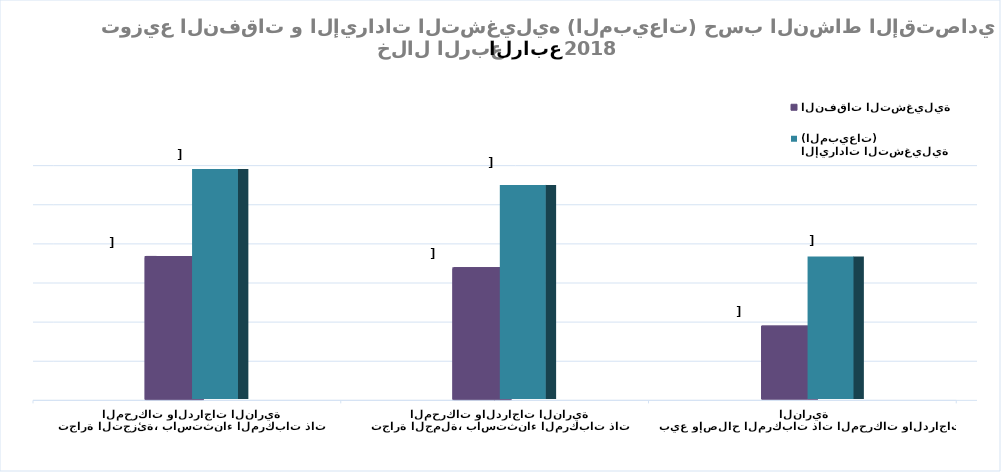
| Category | النفقات التشغيلية | الإيرادات التشغيلية (المبيعات) |
|---|---|---|
| بيع وإصلاح المركبات ذات المحركات والدراجات النارية | 18615917843.003 | 36397268531.698 |
| تجارة الجملة، باستثناء المركبات ذات المحركات والدراجات النارية | 33299483788.135 | 54723284506.779 |
| تجارة التجزئة، باستثناء المركبات ذات المحركات والدراجات النارية | 36193937211.252 | 58792199104.654 |